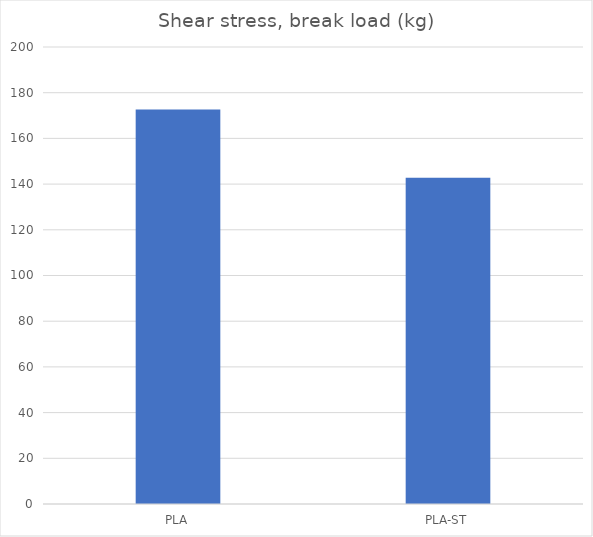
| Category | Break kg |
|---|---|
| PLA | 172.6 |
| PLA-ST | 142.8 |